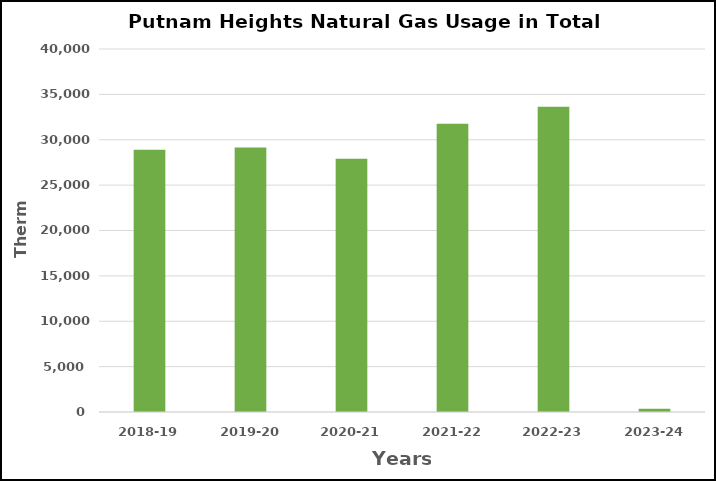
| Category | Series 0 |
|---|---|
| 2018-19 | 28894 |
| 2019-20 | 29151 |
| 2020-21 | 27907 |
| 2021-22 | 31761 |
| 2022-23 | 33628 |
| 2023-24 | 371 |